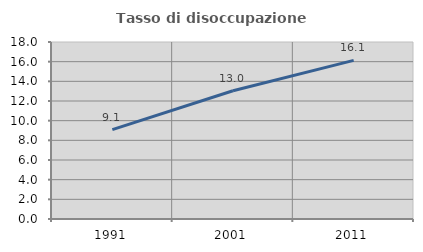
| Category | Tasso di disoccupazione giovanile  |
|---|---|
| 1991.0 | 9.091 |
| 2001.0 | 13.043 |
| 2011.0 | 16.129 |